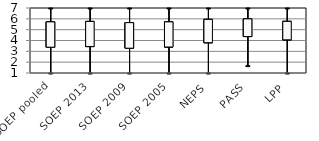
| Category | Series 0 | Series 1 | Series 2 | Series 3 |
|---|---|---|---|---|
| SOEP pooled | 3.38 | 7 | 1 | 5.72 |
| SOEP 2013 | 3.44 | 7 | 1 | 5.76 |
| SOEP 2009 | 3.29 | 7 | 1 | 5.65 |
| SOEP 2005 | 3.4 | 7 | 1 | 5.72 |
| NEPS | 3.795 | 7 | 1 | 5.949 |
| PASS | 4.364 | 7 | 1.68 | 5.996 |
| LPP | 4.062 | 7 | 1 | 5.766 |